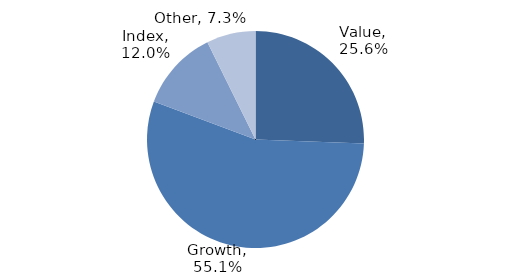
| Category | Investment Style |
|---|---|
| Value | 0.256 |
| Growth | 0.551 |
| Index | 0.12 |
| Other | 0.073 |